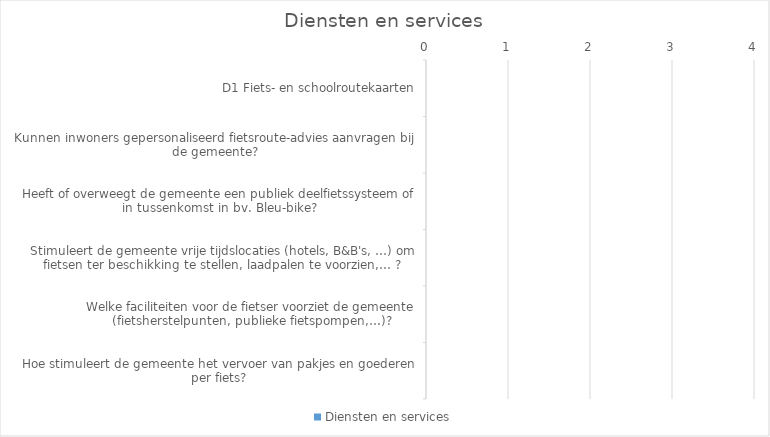
| Category | Diensten en services |
|---|---|
| D1 Fiets- en schoolroutekaarten | 0 |
| Kunnen inwoners gepersonaliseerd fietsroute-advies aanvragen bij de gemeente? | 0 |
| Heeft of overweegt de gemeente een publiek deelfietssysteem of in tussenkomst in bv. Bleu-bike? | 0 |
| Stimuleert de gemeente vrije tijdslocaties (hotels, B&B's, …) om fietsen ter beschikking te stellen, laadpalen te voorzien,… ? | 0 |
| Welke faciliteiten voor de fietser voorziet de gemeente (fietsherstelpunten, publieke fietspompen,…)? | 0 |
| Hoe stimuleert de gemeente het vervoer van pakjes en goederen per fiets? | 0 |